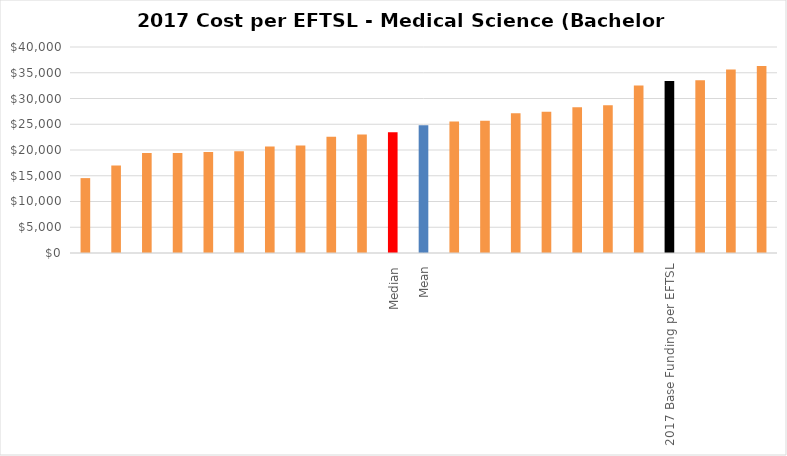
| Category | Series 0 |
|---|---|
|  | 14542.884 |
|  | 17002.232 |
|  | 19414.267 |
|  | 19422.222 |
|  | 19611.844 |
|  | 19746.059 |
|  | 20701.354 |
|  | 20893.043 |
|  | 22563.702 |
|  | 23029.282 |
| Median | 23425.181 |
| Mean | 24811 |
|  | 25517.871 |
|  | 25669.339 |
|  | 27159.087 |
|  | 27420.603 |
|  | 28284.198 |
|  | 28677.184 |
|  | 32512.3 |
| 2017 Base Funding per EFTSL | 33405 |